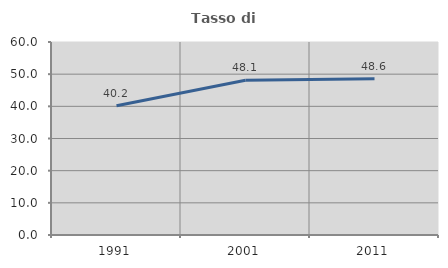
| Category | Tasso di occupazione   |
|---|---|
| 1991.0 | 40.206 |
| 2001.0 | 48.097 |
| 2011.0 | 48.561 |